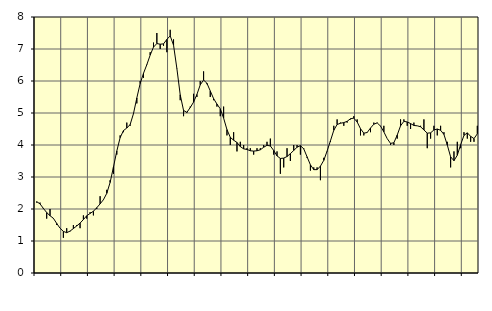
| Category | Piggar | Series 1 |
|---|---|---|
| nan | 2.2 | 2.23 |
| 87.0 | 2.2 | 2.16 |
| 87.0 | 2 | 2.02 |
| 87.0 | 1.7 | 1.89 |
| nan | 2 | 1.79 |
| 88.0 | 1.7 | 1.71 |
| 88.0 | 1.5 | 1.55 |
| 88.0 | 1.4 | 1.4 |
| nan | 1.1 | 1.3 |
| 89.0 | 1.4 | 1.26 |
| 89.0 | 1.3 | 1.31 |
| 89.0 | 1.5 | 1.39 |
| nan | 1.5 | 1.47 |
| 90.0 | 1.4 | 1.56 |
| 90.0 | 1.8 | 1.67 |
| 90.0 | 1.7 | 1.79 |
| nan | 1.9 | 1.86 |
| 91.0 | 1.8 | 1.93 |
| 91.0 | 2 | 2.04 |
| 91.0 | 2.4 | 2.16 |
| nan | 2.3 | 2.29 |
| 92.0 | 2.6 | 2.49 |
| 92.0 | 2.9 | 2.83 |
| 92.0 | 3.1 | 3.31 |
| nan | 3.7 | 3.81 |
| 93.0 | 4.3 | 4.23 |
| 93.0 | 4.4 | 4.45 |
| 93.0 | 4.7 | 4.53 |
| nan | 4.6 | 4.64 |
| 94.0 | 5 | 4.98 |
| 94.0 | 5.3 | 5.47 |
| 94.0 | 6 | 5.92 |
| nan | 6.1 | 6.24 |
| 95.0 | 6.5 | 6.51 |
| 95.0 | 6.9 | 6.81 |
| 95.0 | 7.2 | 7.06 |
| nan | 7.5 | 7.17 |
| 96.0 | 7 | 7.15 |
| 96.0 | 7.1 | 7.16 |
| 96.0 | 6.9 | 7.3 |
| nan | 7.6 | 7.41 |
| 97.0 | 7.3 | 7.12 |
| 97.0 | 6.4 | 6.39 |
| 97.0 | 5.4 | 5.57 |
| nan | 4.9 | 5.08 |
| 98.0 | 5 | 5.02 |
| 98.0 | 5.2 | 5.17 |
| 98.0 | 5.6 | 5.34 |
| nan | 5.5 | 5.58 |
| 99.0 | 6 | 5.88 |
| 99.0 | 6.3 | 6.03 |
| 99.0 | 5.9 | 5.93 |
| nan | 5.5 | 5.69 |
| 0.0 | 5.4 | 5.45 |
| 0.0 | 5.2 | 5.28 |
| 0.0 | 4.9 | 5.13 |
| nan | 5.2 | 4.84 |
| 1.0 | 4.3 | 4.48 |
| 1.0 | 4 | 4.24 |
| 1.0 | 4.4 | 4.15 |
| nan | 3.8 | 4.08 |
| 2.0 | 4.1 | 3.95 |
| 2.0 | 4 | 3.88 |
| 2.0 | 3.9 | 3.86 |
| nan | 3.9 | 3.82 |
| 3.0 | 3.7 | 3.81 |
| 3.0 | 3.9 | 3.82 |
| 3.0 | 3.9 | 3.85 |
| nan | 4 | 3.93 |
| 4.0 | 4.1 | 3.99 |
| 4.0 | 4.2 | 3.97 |
| 4.0 | 3.7 | 3.83 |
| nan | 3.8 | 3.66 |
| 5.0 | 3.1 | 3.58 |
| 5.0 | 3.3 | 3.59 |
| 5.0 | 3.9 | 3.64 |
| nan | 3.5 | 3.73 |
| 6.0 | 4 | 3.83 |
| 6.0 | 4 | 3.93 |
| 6.0 | 3.7 | 3.98 |
| nan | 3.9 | 3.88 |
| 7.0 | 3.6 | 3.63 |
| 7.0 | 3.2 | 3.38 |
| 7.0 | 3.3 | 3.23 |
| nan | 3.3 | 3.23 |
| 8.0 | 2.9 | 3.34 |
| 8.0 | 3.6 | 3.52 |
| 8.0 | 3.8 | 3.81 |
| nan | 4.1 | 4.13 |
| 9.0 | 4.6 | 4.46 |
| 9.0 | 4.8 | 4.64 |
| 9.0 | 4.7 | 4.68 |
| nan | 4.6 | 4.7 |
| 10.0 | 4.7 | 4.74 |
| 10.0 | 4.8 | 4.82 |
| 10.0 | 4.9 | 4.84 |
| nan | 4.8 | 4.72 |
| 11.0 | 4.3 | 4.51 |
| 11.0 | 4.3 | 4.37 |
| 11.0 | 4.4 | 4.39 |
| nan | 4.4 | 4.53 |
| 12.0 | 4.7 | 4.65 |
| 12.0 | 4.7 | 4.69 |
| 12.0 | 4.6 | 4.59 |
| nan | 4.6 | 4.41 |
| 13.0 | 4.2 | 4.2 |
| 13.0 | 4 | 4.05 |
| 13.0 | 4 | 4.07 |
| nan | 4.2 | 4.31 |
| 14.0 | 4.8 | 4.6 |
| 14.0 | 4.8 | 4.74 |
| 14.0 | 4.6 | 4.72 |
| nan | 4.5 | 4.67 |
| 15.0 | 4.7 | 4.61 |
| 15.0 | 4.6 | 4.6 |
| 15.0 | 4.6 | 4.57 |
| nan | 4.8 | 4.47 |
| 16.0 | 3.9 | 4.37 |
| 16.0 | 4.2 | 4.38 |
| 16.0 | 4.6 | 4.47 |
| nan | 4.3 | 4.5 |
| 17.0 | 4.6 | 4.46 |
| 17.0 | 4.4 | 4.33 |
| 17.0 | 4.1 | 4 |
| nan | 3.3 | 3.63 |
| 18.0 | 3.8 | 3.51 |
| 18.0 | 4.1 | 3.68 |
| 18.0 | 3.9 | 4.01 |
| nan | 4.4 | 4.3 |
| 19.0 | 4.2 | 4.38 |
| 19.0 | 4.1 | 4.27 |
| 19.0 | 4.1 | 4.2 |
| nan | 4.6 | 4.35 |